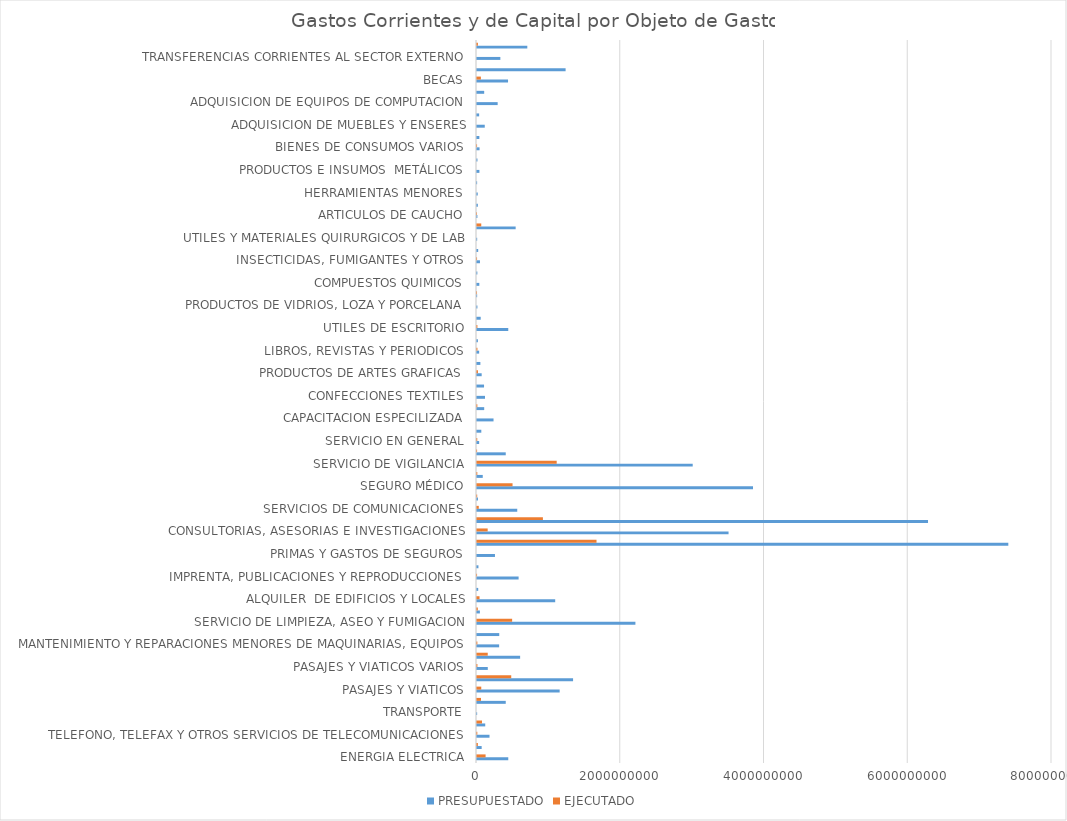
| Category | PRESUPUESTADO | EJECUTADO |
|---|---|---|
| ENERGIA ELECTRICA | 435000000 | 119503160 |
| AGUA | 64950000 | 11957972 |
| TELEFONO, TELEFAX Y OTROS SERVICIOS DE TELECOMUNICACIONES | 174050000 | 4450641 |
| CORREOS Y OTROS SERVICIOS POSTALES | 114500000 | 69745000 |
| TRANSPORTE | 2000000 | 0 |
| TRANSPORTE DE PERSONAS | 400000000 | 55448900 |
| PASAJES Y VIATICOS | 1150000000 | 59306542 |
| VIATICOS Y MOVILIDAD | 1336633884 | 476394785 |
| PASAJES Y VIATICOS VARIOS | 150000000 | 5785389 |
| MANTENIMIENTO Y REPARACIONES MENORES DE EDIFICIOS Y LOCALES | 600000000 | 149449482 |
| MANTENIMIENTO Y REPARACIONES MENORES DE MAQUINARIAS, EQUIPOS | 308000000 | 5248000 |
| MANTEMIENTOS Y REPARACIONES MENORES DE EQUIPOS DE TRANSPORTE | 309600000 | 0 |
| SERVICIO DE LIMPIEZA, ASEO Y FUMIGACION | 2204000000 | 488911024 |
| MANTENIMIENTO Y REPACIONES MENORES DE INSTALACIONES | 40000000 | 11200000 |
| ALQUILER  DE EDIFICIOS Y LOCALES | 1088000000 | 35107678 |
| DE INFORMATICA Y SISTEMAS COMPUTARIZADOS | 17000000 | 0 |
| IMPRENTA, PUBLICACIONES Y REPRODUCCIONES | 578900000 | 916500 |
| SERVICIOS BANCARIOS | 20000000 | 0 |
| PRIMAS Y GASTOS DE SEGUROS | 250000000 | 0 |
| PUBLICIDAD Y PROPAGANDA | 7392277953 | 1662865689 |
| CONSULTORIAS, ASESORIAS E INVESTIGACIONES | 3499799720 | 148472499 |
| PROMOCIONES Y EXPOSICIONES | 6275000000 | 916850000 |
| SERVICIOS DE COMUNICACIONES | 560000000 | 24528651 |
| SERVICIOS TECNICOS Y PROFESIONALES | 13500000 | 2847514 |
| SEGURO MÉDICO | 3840000000 | 494515000 |
| SERVICIO DE CEREMONIAL | 80000000 | 4379000 |
| SERVICIO DE VIGILANCIA | 3001206250 | 1108778458 |
| SERVICIO DE CATERING | 400000000 | 1355000 |
| SERVICIO EN GENERAL | 30000000 | 3712500 |
| CAPACITACION DEL PERSONAL  DEL ESTADO | 60000000 | 0 |
| CAPACITACION ESPECILIZADA | 230000000 | 0 |
| ALIMENTOS PARA LAS PERSONAS | 100210000 | 4977400 |
| CONFECCIONES TEXTILES | 111275000 | 0 |
| PAPEL DE ESCRITORIO Y CARTON | 98000000 | 0 |
| PRODUCTOS DE ARTES GRAFICAS | 65000000 | 13337400 |
| PRODUCTOS DE PAPEL Y CARTON | 47000000 | 0 |
| LIBROS, REVISTAS Y PERIODICOS | 30000000 | 6149500 |
| ELEMENTOS DE LIMPIEZA | 12610000 | 0 |
| UTILES DE ESCRITORIO | 435000000 | 5590000 |
| UTILES Y MATERIALES ELECTRICOS | 51554800 | 0 |
| PRODUCTOS DE VIDRIOS, LOZA Y PORCELANA | 5850000 | 0 |
| REPUESTOS Y ACCESORIOS MENORES | 2000000 | 390000 |
| COMPUESTOS QUIMICOS | 32383000 | 0 |
| PRODUCTOS FARMACEUTICOS | 5000000 | 0 |
| INSECTICIDAS, FUMIGANTES Y OTROS | 41250000 | 820000 |
| TINTAS, PINTURAS Y COLORANTES | 16600000 | 0 |
| UTILES Y MATERIALES QUIRURGICOS Y DE LAB | 2400000 | 0 |
| COMBUSTIBLES  | 537784000 | 59180372 |
| ARTICULOS DE CAUCHO | 5550000 | 165000 |
| CUBIERTAS Y CÁMARAS DE AIRE | 12000000 | 0 |
| HERRAMIENTAS MENORES | 10440000 | 0 |
| ARTICULOS DE PLASTICOS | 1710000 | 0 |
| PRODUCTOS E INSUMOS  METÁLICOS | 33570000 | 0 |
| PRODUCTOS E INSUMOS NO METÁLICOS | 6500000 | 0 |
| BIENES DE CONSUMOS VARIOS | 35540000 | 942000 |
| HERRAMIENTAS, APARATOS E INSTRUMENTOS EN GRAL  | 32800000 | 0 |
| ADQUISICION DE MUEBLES Y ENSERES | 108000000 | 0 |
| ADQUISICION DE EQUIPOS DE OFICINA Y COMPUTACIÓN | 30000000 | 0 |
| ADQUISICION DE EQUIPOS DE COMPUTACION | 287500000 | 0 |
| ACTIVOS INTAGIBLES | 100000000 | 0 |
| BECAS | 432000000 | 54000000 |
| APORTE A ENTIDADES EDUCATIVAS E INST. SIN FINES DE LUCRO | 1232766742 | 0 |
| TRANSFERENCIAS CORRIENTES AL SECTOR EXTERNO | 325000000 | 0 |
| PAGO DE IMPUESTOS, TASA, GASTOS JUDICIALES Y OTROS | 699860316 | 12645275 |